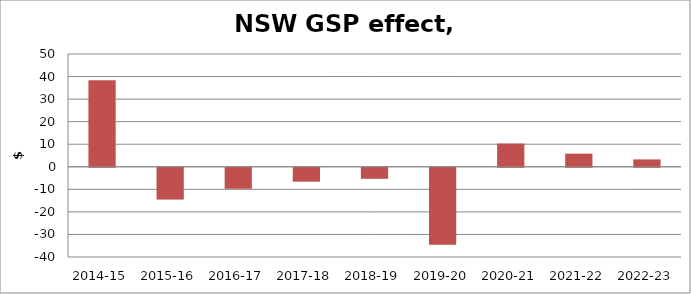
| Category | Series 0 |
|---|---|
| 2014-15 | 38.36 |
| 2015-16 | -14.099 |
| 2016-17 | -9.297 |
| 2017-18 | -6.154 |
| 2018-19 | -4.877 |
| 2019-20 | -34.164 |
| 2020-21 | 10.312 |
| 2021-22 | 5.824 |
| 2022-23 | 3.268 |